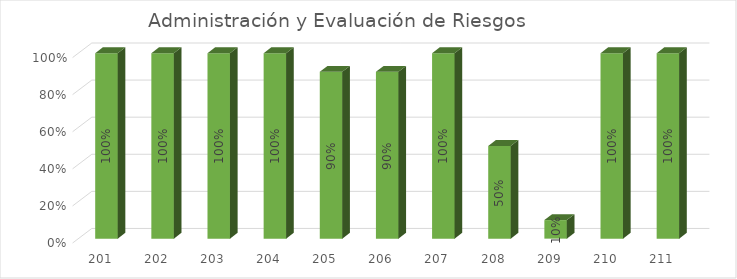
| Category | % Avance |
|---|---|
| 201.0 | 1 |
| 202.0 | 1 |
| 203.0 | 1 |
| 204.0 | 1 |
| 205.0 | 0.9 |
| 206.0 | 0.9 |
| 207.0 | 1 |
| 208.0 | 0.5 |
| 209.0 | 0.1 |
| 210.0 | 1 |
| 211.0 | 1 |